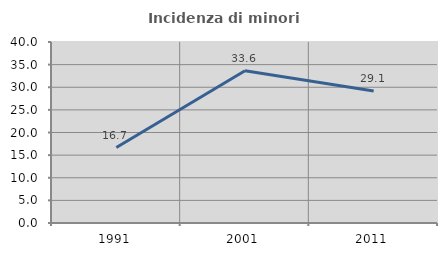
| Category | Incidenza di minori stranieri |
|---|---|
| 1991.0 | 16.667 |
| 2001.0 | 33.636 |
| 2011.0 | 29.15 |